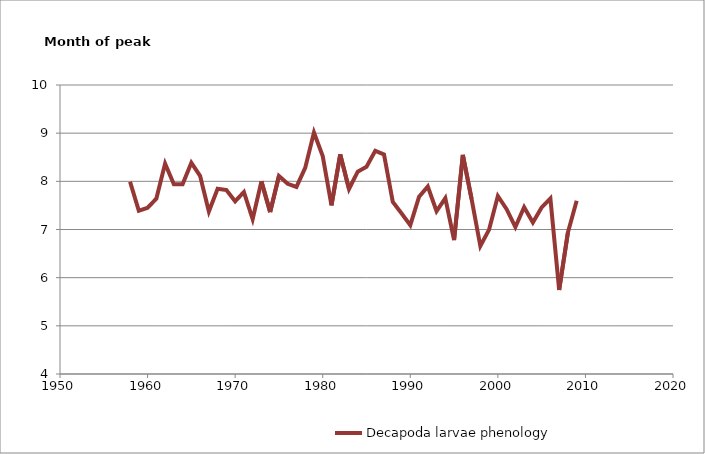
| Category | Decapoda larvae phenology |
|---|---|
| 1958.0 | 7.991 |
| 1959.0 | 7.39 |
| 1960.0 | 7.451 |
| 1961.0 | 7.64 |
| 1962.0 | 8.368 |
| 1963.0 | 7.94 |
| 1964.0 | 7.94 |
| 1965.0 | 8.386 |
| 1966.0 | 8.112 |
| 1967.0 | 7.374 |
| 1968.0 | 7.846 |
| 1969.0 | 7.819 |
| 1970.0 | 7.585 |
| 1971.0 | 7.778 |
| 1972.0 | 7.216 |
| 1973.0 | 7.999 |
| 1974.0 | 7.361 |
| 1975.0 | 8.112 |
| 1976.0 | 7.95 |
| 1977.0 | 7.883 |
| 1978.0 | 8.279 |
| 1979.0 | 9.014 |
| 1980.0 | 8.523 |
| 1981.0 | 7.502 |
| 1982.0 | 8.56 |
| 1983.0 | 7.841 |
| 1984.0 | 8.201 |
| 1985.0 | 8.302 |
| 1986.0 | 8.634 |
| 1987.0 | 8.558 |
| 1988.0 | 7.574 |
| 1989.0 | 7.335 |
| 1990.0 | 7.09 |
| 1991.0 | 7.679 |
| 1992.0 | 7.892 |
| 1993.0 | 7.38 |
| 1994.0 | 7.65 |
| 1995.0 | 6.78 |
| 1996.0 | 8.55 |
| 1997.0 | 7.634 |
| 1998.0 | 6.656 |
| 1999.0 | 6.997 |
| 2000.0 | 7.696 |
| 2001.0 | 7.421 |
| 2002.0 | 7.05 |
| 2003.0 | 7.464 |
| 2004.0 | 7.147 |
| 2005.0 | 7.457 |
| 2006.0 | 7.642 |
| 2007.0 | 5.743 |
| 2008.0 | 6.938 |
| 2009.0 | 7.596 |